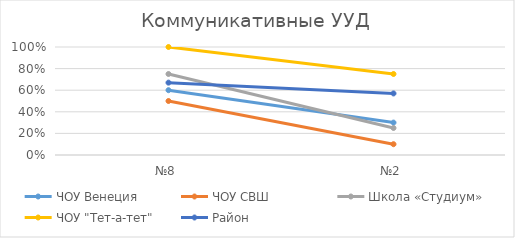
| Category | ЧОУ Венеция | ЧОУ СВШ | Школа «Студиум» | ЧОУ "Тет-а-тет" | Район |
|---|---|---|---|---|---|
| №8 | 0.6 | 0.5 | 0.75 | 1 | 0.67 |
| №2 | 0.3 | 0.1 | 0.25 | 0.75 | 0.57 |